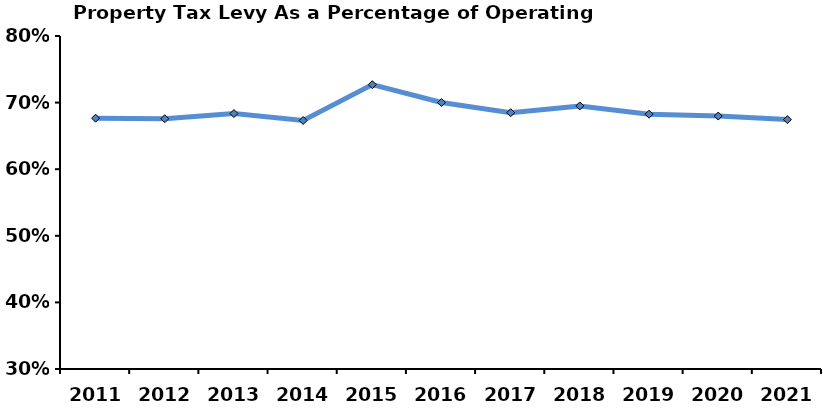
| Category | As a % Operating Revenue |
|---|---|
| 2011.0 | 0.677 |
| 2012.0 | 0.676 |
| 2013.0 | 0.684 |
| 2014.0 | 0.673 |
| 2015.0 | 0.727 |
| 2016.0 | 0.7 |
| 2017.0 | 0.685 |
| 2018.0 | 0.695 |
| 2019.0 | 0.683 |
| 2020.0 | 0.68 |
| 2021.0 | 0.674 |